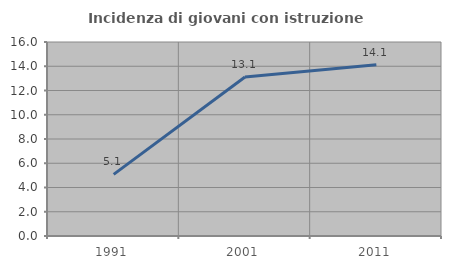
| Category | Incidenza di giovani con istruzione universitaria |
|---|---|
| 1991.0 | 5.085 |
| 2001.0 | 13.115 |
| 2011.0 | 14.13 |